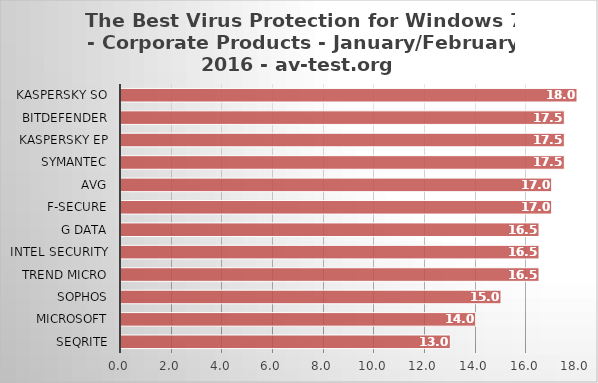
| Category | Series 0 |
|---|---|
| Seqrite | 13 |
| Microsoft | 14 |
| Sophos | 15 |
| Trend Micro | 16.5 |
| Intel Security | 16.5 |
| G Data | 16.5 |
| F-Secure | 17 |
| AVG | 17 |
| Symantec | 17.5 |
| Kaspersky EP | 17.5 |
| Bitdefender | 17.5 |
| Kaspersky SO | 18 |